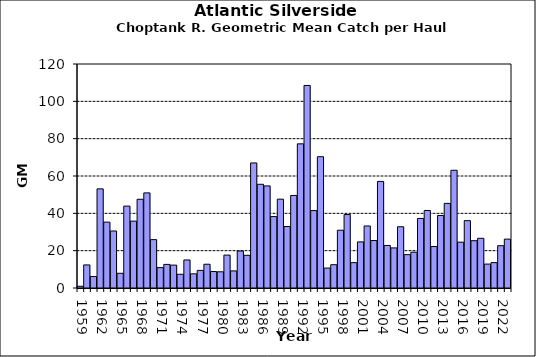
| Category | Series 0 |
|---|---|
| 1959.0 | 0.929 |
| 1960.0 | 12.364 |
| 1961.0 | 6.16 |
| 1962.0 | 53.111 |
| 1963.0 | 35.284 |
| 1964.0 | 30.545 |
| 1965.0 | 7.884 |
| 1966.0 | 43.86 |
| 1967.0 | 35.816 |
| 1968.0 | 47.532 |
| 1969.0 | 50.95 |
| 1970.0 | 25.913 |
| 1971.0 | 10.915 |
| 1972.0 | 12.645 |
| 1973.0 | 12.259 |
| 1974.0 | 7.354 |
| 1975.0 | 15.021 |
| 1976.0 | 7.593 |
| 1977.0 | 9.424 |
| 1978.0 | 12.732 |
| 1979.0 | 8.818 |
| 1980.0 | 8.684 |
| 1981.0 | 17.624 |
| 1982.0 | 9.16 |
| 1983.0 | 19.809 |
| 1984.0 | 17.511 |
| 1985.0 | 66.999 |
| 1986.0 | 55.562 |
| 1987.0 | 54.681 |
| 1988.0 | 38.266 |
| 1989.0 | 47.585 |
| 1990.0 | 32.93 |
| 1991.0 | 49.576 |
| 1992.0 | 77.223 |
| 1993.0 | 108.498 |
| 1994.0 | 41.47 |
| 1995.0 | 70.323 |
| 1996.0 | 10.678 |
| 1997.0 | 12.475 |
| 1998.0 | 30.948 |
| 1999.0 | 39.355 |
| 2000.0 | 13.584 |
| 2001.0 | 24.698 |
| 2002.0 | 33.225 |
| 2003.0 | 25.426 |
| 2004.0 | 57.1 |
| 2005.0 | 22.797 |
| 2006.0 | 21.474 |
| 2007.0 | 32.819 |
| 2008.0 | 17.872 |
| 2009.0 | 19.199 |
| 2010.0 | 37.255 |
| 2011.0 | 41.527 |
| 2012.0 | 22.208 |
| 2013.0 | 38.851 |
| 2014.0 | 45.314 |
| 2015.0 | 63.064 |
| 2016.0 | 24.556 |
| 2017.0 | 36.092 |
| 2018.0 | 25.343 |
| 2019.0 | 26.615 |
| 2020.0 | 12.81 |
| 2021.0 | 13.587 |
| 2022.0 | 22.655 |
| 2023.0 | 26.189 |